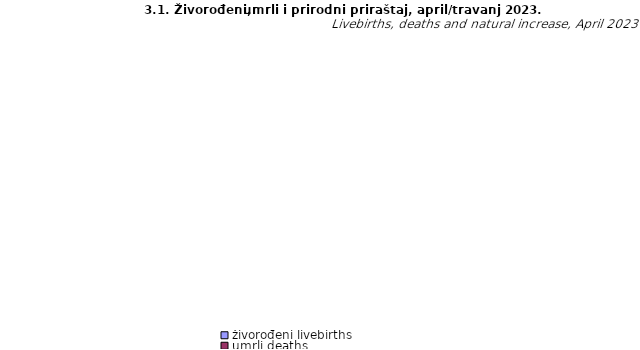
| Category | živorođeni livebirths | umrli deaths | prirodni priraštaj natural increase |
|---|---|---|---|
| Unsko - sanski | 63 | 145 | -82 |
| Kanton Posavski | 9 | 32 | -23 |
| Tuzlanski | 217 | 278 | -61 |
| Zeničko - dobojski | 236 | 283 | -47 |
| Bosansko - podrinjski | 14 | 30 | -16 |
| Srednjobosanski | 129 | 174 | -45 |
| Hercegovačko-neretvanski | 99 | 163 | -64 |
| Zapadnohercegovački | 62 | 69 | -7 |
| Kanton Sarajevo | 288 | 376 | -88 |
| Kanton 10 | 23 | 47 | -24 |